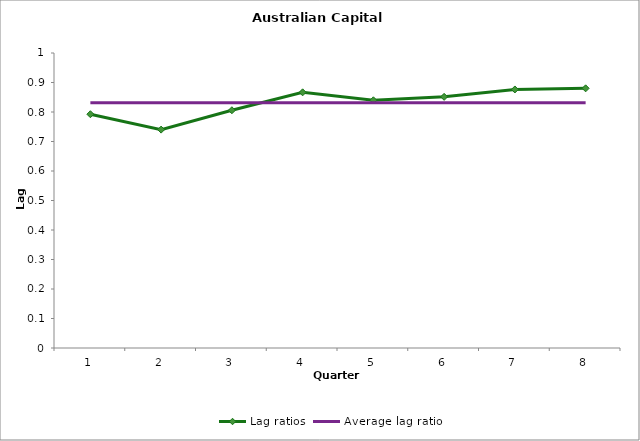
| Category | Lag ratios | Average lag ratio |
|---|---|---|
| 0 | 0.792 | 0.832 |
| 1 | 0.74 | 0.832 |
| 2 | 0.806 | 0.832 |
| 3 | 0.867 | 0.832 |
| 4 | 0.84 | 0.832 |
| 5 | 0.851 | 0.832 |
| 6 | 0.876 | 0.832 |
| 7 | 0.88 | 0.832 |